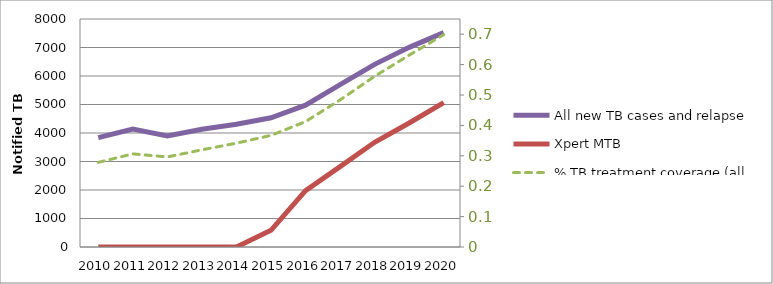
| Category | All new TB cases and relapse | Xpert MTB |
|---|---|---|
| 2010.0 | 3836 | 0 |
| 2011.0 | 4136 | 0 |
| 2012.0 | 3896 | 0 |
| 2013.0 | 4130 | 0 |
| 2014.0 | 4305 | 0 |
| 2015.0 | 4536 | 587 |
| 2016.0 | 4978 | 1975 |
| 2017.0 | 5700.1 | 2818.75 |
| 2018.0 | 6408.2 | 3675 |
| 2019.0 | 7004.7 | 4350 |
| 2020.0 | 7522.5 | 5062.5 |